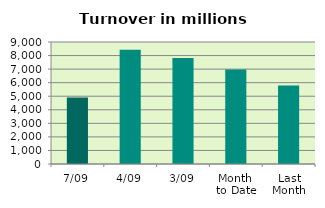
| Category | Series 0 |
|---|---|
| 7/09 | 4914.024 |
| 4/09 | 8421.847 |
| 3/09 | 7817.145 |
| Month 
to Date | 6979.76 |
| Last
Month | 5795.357 |